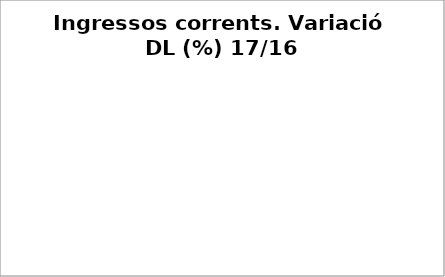
| Category | Series 0 |
|---|---|
| Impostos locals | 0.021 |
| Participació Tributs de l'Estat | 0.048 |
| Taxes i altres ingressos | -0.057 |
| Transferències corrents (exc. FCF) | 0.396 |
| Ingressos patrimonials | 0.284 |
| Ingressos corrents | 0.038 |